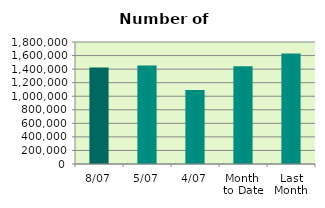
| Category | Series 0 |
|---|---|
| 8/07 | 1425216 |
| 5/07 | 1452362 |
| 4/07 | 1092702 |
| Month 
to Date | 1443062.667 |
| Last
Month | 1630183.4 |